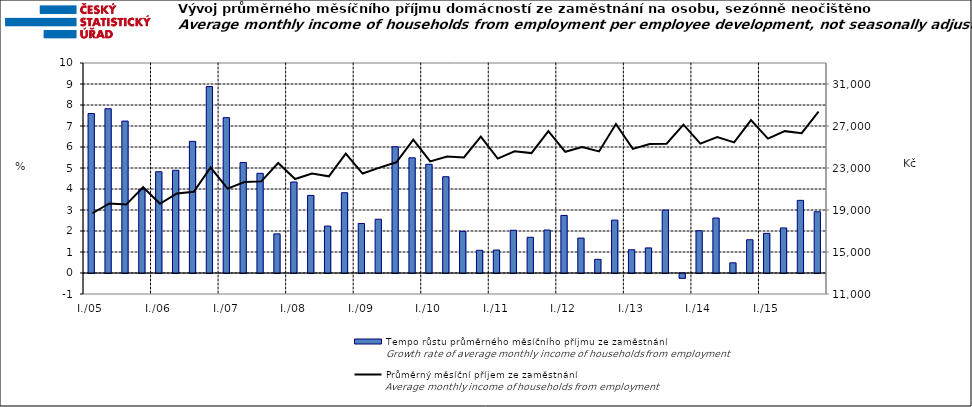
| Category | Tempo růstu průměrného měsíčního příjmu ze zaměstnání |
|---|---|
| I./05 | 7.592 |
|  | 7.822 |
|  | 7.233 |
|  | 3.981 |
| I./06 | 4.822 |
|  | 4.892 |
|  | 6.269 |
|  | 8.878 |
| I./07 | 7.399 |
|  | 5.263 |
|  | 4.746 |
|  | 1.864 |
| I./08 | 4.333 |
|  | 3.694 |
|  | 2.233 |
|  | 3.823 |
| I./09 | 2.357 |
|  | 2.56 |
|  | 6.011 |
|  | 5.485 |
| I./10 | 5.177 |
|  | 4.584 |
|  | 1.983 |
|  | 1.08 |
| I./11 | 1.094 |
|  | 2.034 |
|  | 1.701 |
|  | 2.046 |
| I./12 | 2.742 |
|  | 1.662 |
|  | 0.65 |
|  | 2.518 |
| I./13 | 1.107 |
|  | 1.195 |
|  | 2.996 |
|  | -0.228 |
| I./14 | 2.011 |
|  | 2.618 |
|  | 0.484 |
|  | 1.584 |
| I./15 | 1.888 |